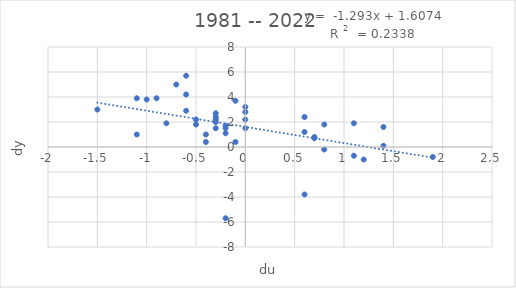
| Category | dy |
|---|---|
| 1.4 | 0.1 |
| 1.9000000000000004 | -0.8 |
| 1.3999999999999995 | 1.6 |
| 0.0 | 2.8 |
| 0.0 | 2.2 |
| -0.2999999999999998 | 2.4 |
| 0.0 | 1.5 |
| -0.09999999999999964 | 3.7 |
| -0.9000000000000004 | 3.9 |
| -0.5999999999999996 | 5.7 |
| -0.7000000000000002 | 5 |
| 1.0999999999999996 | 1.9 |
| 1.2000000000000002 | -1 |
| 0.6000000000000005 | 2.4 |
| -0.20000000000000107 | 1.5 |
| 0.7000000000000011 | 0.8 |
| 0.7999999999999989 | 1.8 |
| -0.29999999999999893 | 2 |
| -0.8000000000000007 | 1.9 |
| -0.5999999999999996 | 2.9 |
| -0.20000000000000018 | 1.7 |
| 0.7999999999999998 | -0.2 |
| 1.0999999999999996 | -0.7 |
| 0.6000000000000014 | 1.2 |
| 0.6999999999999993 | 0.7 |
| -1.0 | 3.8 |
| -1.5 | 3 |
| -1.0999999999999996 | 1 |
| -0.20000000000000018 | -5.7 |
| -0.6000000000000005 | 4.2 |
| -1.0999999999999996 | 3.9 |
| -0.40000000000000036 | 0.4 |
| -0.09999999999999964 | 0.4 |
| -0.2999999999999998 | 2.2 |
| -0.2999999999999998 | 1.5 |
| -0.5000000000000004 | 2.2 |
| -0.2999999999999998 | 2.7 |
| -0.3999999999999999 | 1 |
| -0.20000000000000018 | 1.1 |
| 0.6000000000000001 | -3.8 |
| 0.0 | 3.2 |
| -0.5 | 1.8 |